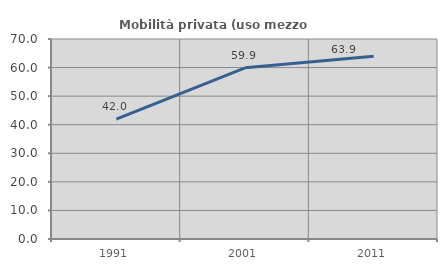
| Category | Mobilità privata (uso mezzo privato) |
|---|---|
| 1991.0 | 41.975 |
| 2001.0 | 59.927 |
| 2011.0 | 63.943 |